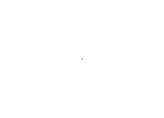
| Category | Series 0 |
|---|---|
| Available | 11915.7 |
| Picked | 0 |